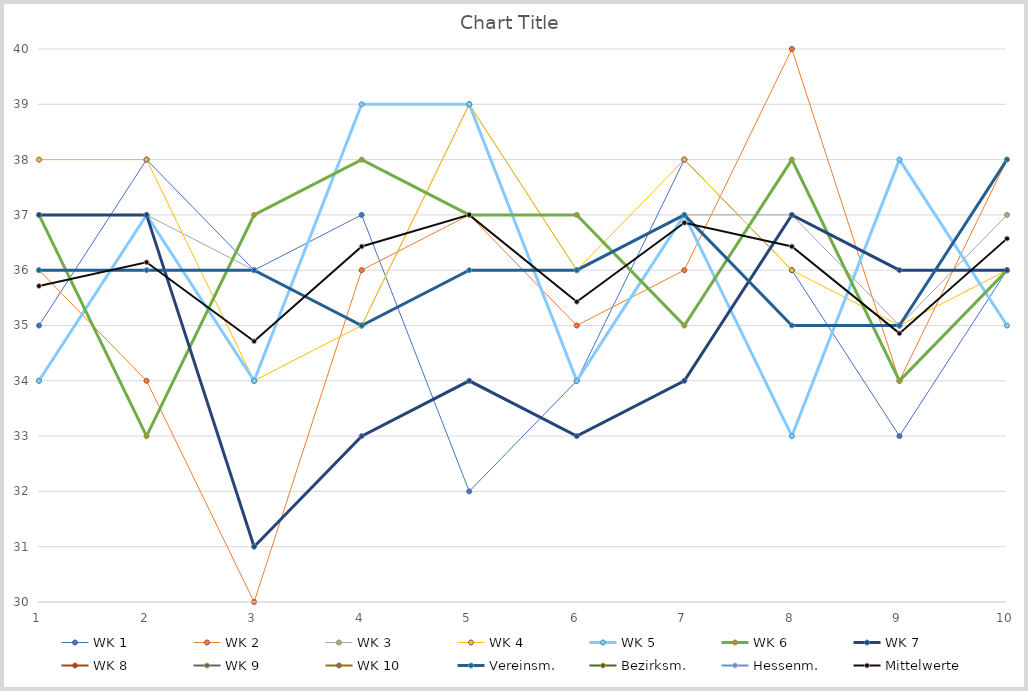
| Category | WK 1 | WK 2 | WK 3 | WK 4 | WK 5 | WK 6 | WK 7 | WK 8 | WK 9 | WK 10 | Vereinsm. | Bezirksm. | Hessenm. | Mittelwerte |
|---|---|---|---|---|---|---|---|---|---|---|---|---|---|---|
| 0 | 35 | 36 | 34 | 38 | 34 | 37 | 37 | 0 | 0 | 0 | 36 | 0 | 0 | 35.714 |
| 1 | 38 | 34 | 37 | 38 | 37 | 33 | 37 | 0 | 0 | 0 | 36 | 0 | 0 | 36.143 |
| 2 | 36 | 30 | 36 | 34 | 34 | 37 | 31 | 0 | 0 | 0 | 36 | 0 | 0 | 34.714 |
| 3 | 37 | 36 | 35 | 35 | 39 | 38 | 33 | 0 | 0 | 0 | 35 | 0 | 0 | 36.429 |
| 4 | 32 | 37 | 39 | 39 | 39 | 37 | 34 | 0 | 0 | 0 | 36 | 0 | 0 | 37 |
| 5 | 34 | 35 | 36 | 36 | 34 | 37 | 33 | 0 | 0 | 0 | 36 | 0 | 0 | 35.429 |
| 6 | 38 | 36 | 37 | 38 | 37 | 35 | 34 | 0 | 0 | 0 | 37 | 0 | 0 | 36.857 |
| 7 | 36 | 40 | 37 | 36 | 33 | 38 | 37 | 0 | 0 | 0 | 35 | 0 | 0 | 36.429 |
| 8 | 33 | 34 | 35 | 35 | 38 | 34 | 36 | 0 | 0 | 0 | 35 | 0 | 0 | 34.857 |
| 9 | 36 | 38 | 37 | 36 | 35 | 36 | 36 | 0 | 0 | 0 | 38 | 0 | 0 | 36.571 |